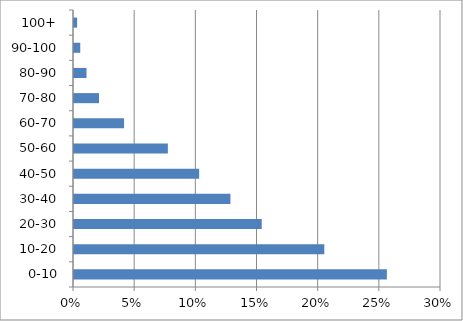
| Category | Series 0 |
|---|---|
| 0-10 | 0.256 |
| 10-20 | 0.205 |
| 20-30 | 0.153 |
| 30-40 | 0.128 |
| 40-50 | 0.102 |
| 50-60 | 0.077 |
| 60-70 | 0.041 |
| 70-80 | 0.02 |
| 80-90 | 0.01 |
| 90-100 | 0.005 |
| 100+ | 0.003 |